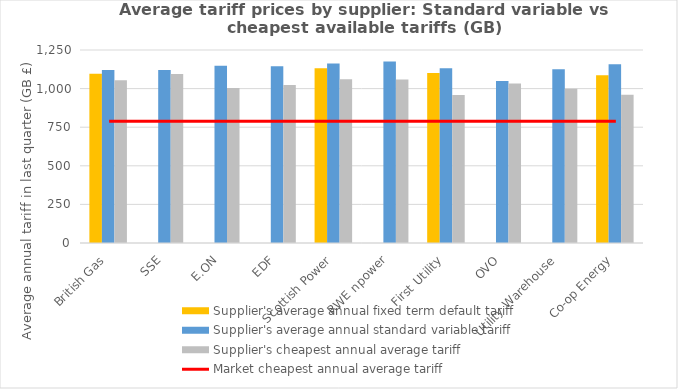
| Category | Supplier's average annual fixed term default tariff | Supplier's average annual standard variable tariff | Supplier's cheapest annual average tariff |
|---|---|---|---|
| British Gas | 1096.243 | 1119.699 | 1054.412 |
| SSE | 0 | 1120.669 | 1094.494 |
| E.ON | 0 | 1148.536 | 1004.364 |
| EDF | 0 | 1145.191 | 1022.894 |
| Scottish Power | 1132.402 | 1161.88 | 1059.949 |
| RWE npower | 0 | 1175.765 | 1058.686 |
| First Utility | 1101.023 | 1131.771 | 958.016 |
| OVO | 0 | 1049.19 | 1033.595 |
| Utility Warehouse | 0 | 1125.228 | 999.398 |
| Co-op Energy | 1086.417 | 1157.597 | 960.094 |